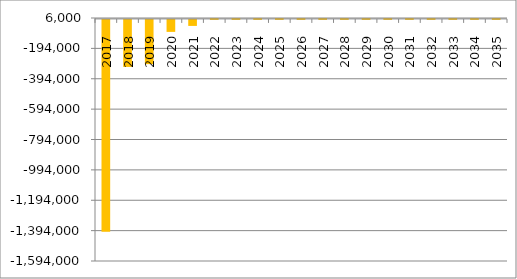
| Category | Series 0 |
|---|---|
| 2017.0 | -1394924.018 |
| 2018.0 | -309556.099 |
| 2019.0 | -291021.603 |
| 2020.0 | -78887.238 |
| 2021.0 | -39563.04 |
| 2022.0 | 74810.245 |
| 2023.0 | 160547.101 |
| 2024.0 | 218023.035 |
| 2025.0 | 275673.035 |
| 2026.0 | 275673.035 |
| 2027.0 | 275673.035 |
| 2028.0 | 275673.035 |
| 2029.0 | 275673.035 |
| 2030.0 | 275673.035 |
| 2031.0 | 3278155.679 |
| 2032.0 | 580623.035 |
| 2033.0 | 580623.035 |
| 2034.0 | 580623.035 |
| 2035.0 | 580623.035 |